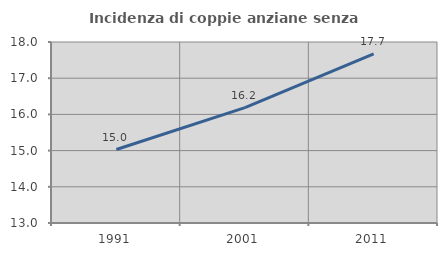
| Category | Incidenza di coppie anziane senza figli  |
|---|---|
| 1991.0 | 15.03 |
| 2001.0 | 16.186 |
| 2011.0 | 17.675 |